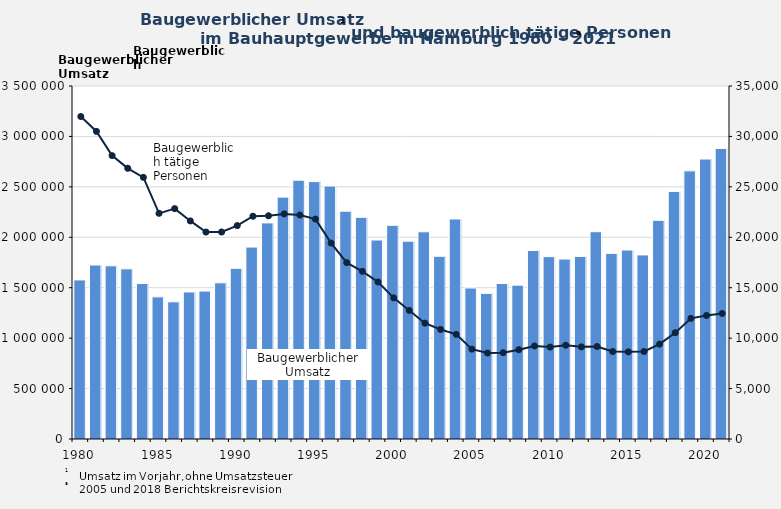
| Category | Baugewerblicher Umsatz in 1 000 Euro |
|---|---|
| 1980.0 | 1577270 |
| 1981.0 | 1725081 |
| 1982.0 | 1717054 |
| 1983.0 | 1687028 |
| 1984.0 | 1542105 |
| 1985.0 | 1409475 |
| 1986.0 | 1360220 |
| 1987.0 | 1457919 |
| 1988.0 | 1466564 |
| 1989.0 | 1548322 |
| 1990.0 | 1692218 |
| 1991.0 | 1902955 |
| 1992.0 | 2142829 |
| 1993.0 | 2398226 |
| 1994.0 | 2566172 |
| 1995.0 | 2551976 |
| 1996.0 | 2508374 |
| 1997.0 | 2258721 |
| 1998.0 | 2198312 |
| 1999.0 | 1973038 |
| 2000.0 | 2118942 |
| 2001.0 | 1961657 |
| 2002.0 | 2054471 |
| 2003.0 | 1811409 |
| 2004.0 | 2181467 |
| 2005.0 | 1497168 |
| 2006.0 | 1443884 |
| 2007.0 | 1541748 |
| 2008.0 | 1525609 |
| 2009.0 | 1868990 |
| 2010.0 | 1808186 |
| 2011.0 | 1783985 |
| 2012.0 | 1810324 |
| 2013.0 | 2055370 |
| 2014.0 | 1840447 |
| 2015.0 | 1873640 |
| 2016.0 | 1825008 |
| 2017.0 | 2168006 |
| 2018.0 | 2454584 |
| 2019.0 | 2658557 |
| 2020.0 | 2775882 |
| 2021.0 | 2880717 |